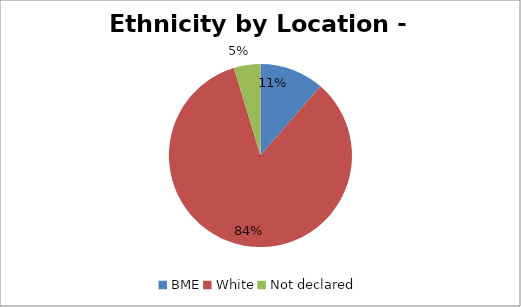
| Category | Series 0 |
|---|---|
| BME | 75 |
| White | 554 |
| Not declared | 31 |